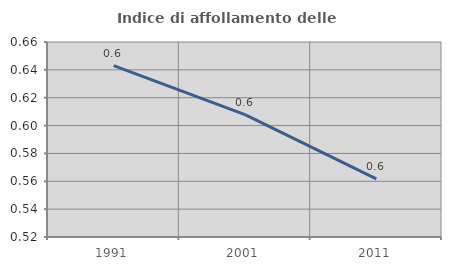
| Category | Indice di affollamento delle abitazioni  |
|---|---|
| 1991.0 | 0.643 |
| 2001.0 | 0.608 |
| 2011.0 | 0.562 |